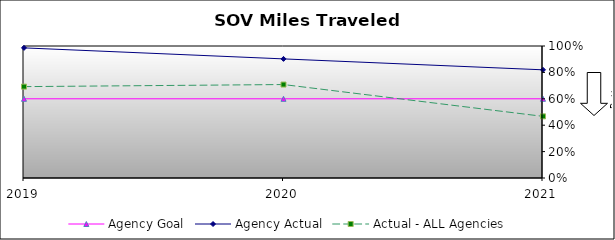
| Category | Agency Goal | Agency Actual | Actual - ALL Agencies |
|---|---|---|---|
| 2019.0 | 0.6 | 0.986 | 0.692 |
| 2020.0 | 0.6 | 0.902 | 0.708 |
| 2021.0 | 0.6 | 0.82 | 0.467 |